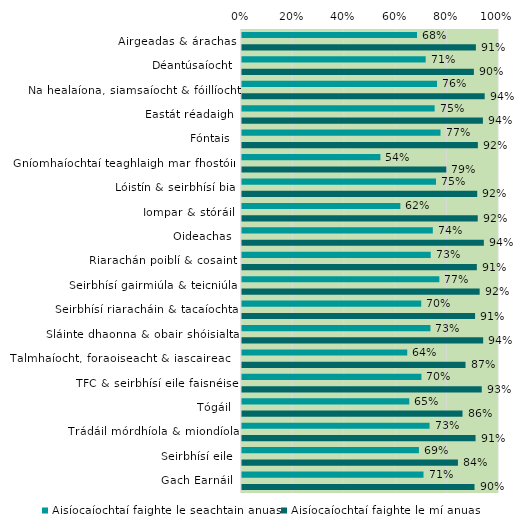
| Category | Aisíocaíochtaí faighte le seachtain anuas | Aisíocaíochtaí faighte le mí anuas |
|---|---|---|
| Airgeadas & árachas | 0.681 | 0.91 |
| Déantúsaíocht | 0.715 | 0.902 |
| Na healaíona, siamsaíocht & fóillíocht | 0.759 | 0.944 |
| Eastát réadaigh | 0.75 | 0.937 |
| Fóntais | 0.772 | 0.918 |
| Gníomhaíochtaí teaghlaigh mar fhostóirí | 0.538 | 0.795 |
| Lóistín & seirbhísí bia | 0.755 | 0.915 |
| Iompar & stóráil | 0.616 | 0.917 |
| Oideachas | 0.742 | 0.941 |
| Riarachán poiblí & cosaint | 0.734 | 0.914 |
| Seirbhísí gairmiúla & teicniúla | 0.768 | 0.925 |
| Seirbhísí riaracháin & tacaíochta | 0.697 | 0.907 |
| Sláinte dhaonna & obair shóisialta | 0.733 | 0.938 |
| Talmhaíocht, foraoiseacht & iascaireacht | 0.643 | 0.87 |
| TFC & seirbhísí eile faisnéise | 0.698 | 0.933 |
| Tógáil | 0.651 | 0.858 |
| Trádáil mórdhíola & miondíola | 0.73 | 0.909 |
| Seirbhísí eile | 0.689 | 0.84 |
| Gach Earnáil | 0.706 | 0.905 |